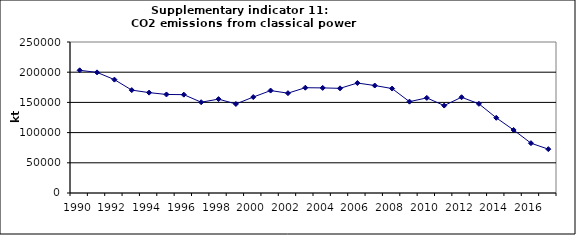
| Category | CO2 emissions from classical power production, kt |
|---|---|
| 1990 | 203115.85 |
| 1991 | 199721.534 |
| 1992 | 187714.379 |
| 1993 | 170373.17 |
| 1994 | 166199.335 |
| 1995 | 163145.428 |
| 1996 | 162822.57 |
| 1997 | 150321.241 |
| 1998 | 155426.507 |
| 1999 | 147395.71 |
| 2000 | 158823.564 |
| 2001 | 169590.664 |
| 2002 | 165294.088 |
| 2003 | 174330.216 |
| 2004 | 174017.597 |
| 2005 | 173273.013 |
| 2006 | 182075.645 |
| 2007 | 177933.04 |
| 2008 | 172932.553 |
| 2009 | 151215.65 |
| 2010 | 157455.009 |
| 2011 | 144738.835 |
| 2012 | 158559.244 |
| 2013 | 147644.747 |
| 2014 | 124513.313 |
| 2015 | 104336.22 |
| 2016 | 82490.147 |
| 2017 | 72598.014 |